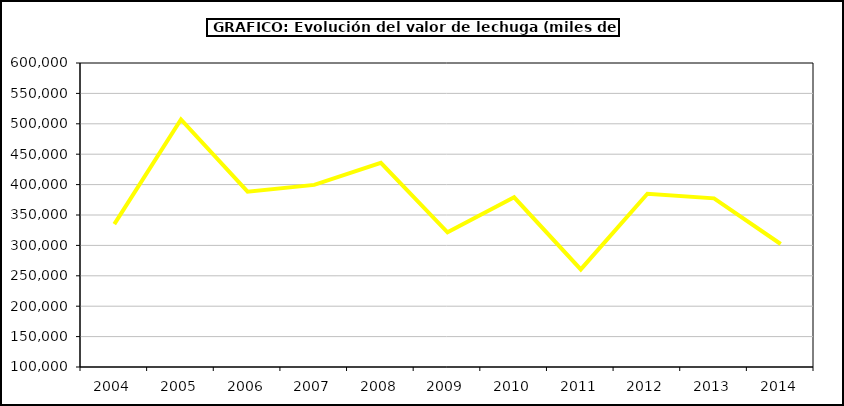
| Category | Valor |
|---|---|
| 2004.0 | 334881.794 |
| 2005.0 | 507045.478 |
| 2006.0 | 388429.234 |
| 2007.0 | 399513.219 |
| 2008.0 | 435724.17 |
| 2009.0 | 321491.177 |
| 2010.0 | 379118.276 |
| 2011.0 | 260530.8 |
| 2012.0 | 384970.514 |
| 2013.0 | 377357.296 |
| 2014.0 | 302294.348 |